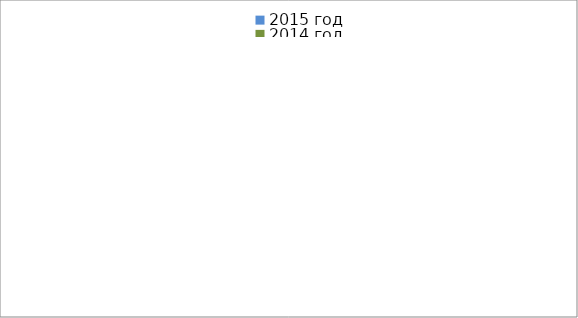
| Category | 2015 год | 2014 год |
|---|---|---|
|  - поджог | 29 | 25 |
|  - неосторожное обращение с огнём | 62 | 44 |
|  - НПТЭ электрооборудования | 8 | 20 |
|  - НПУ и Э печей | 71 | 69 |
|  - НПУ и Э транспортных средств | 42 | 60 |
|   -Шалость с огнем детей | 3 | 0 |
|  -НППБ при эксплуатации эл.приборов | 13 | 19 |
|  - курение | 25 | 22 |
| - прочие | 106 | 106 |
| - не установленные причины | 11 | 10 |